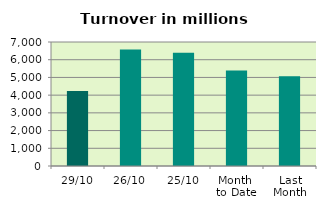
| Category | Series 0 |
|---|---|
| 29/10 | 4235.484 |
| 26/10 | 6571.973 |
| 25/10 | 6397.654 |
| Month 
to Date | 5392.766 |
| Last
Month | 5068.328 |